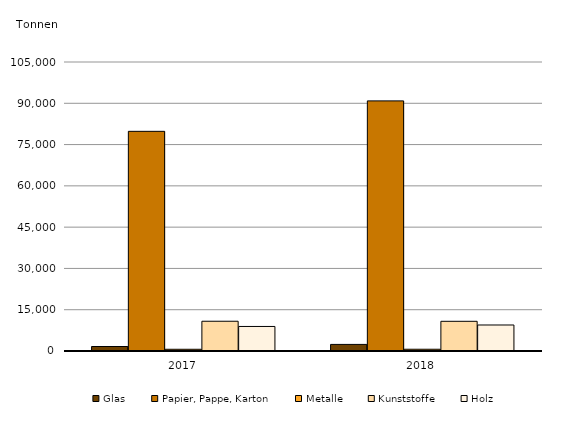
| Category | Glas | Papier, Pappe, Karton | Metalle | Kunststoffe | Holz |
|---|---|---|---|---|---|
| 2017.0 | 1630 | 79806 | 628 | 10813 | 8917 |
| 2018.0 | 2393 | 90872 | 636 | 10791 | 9447 |